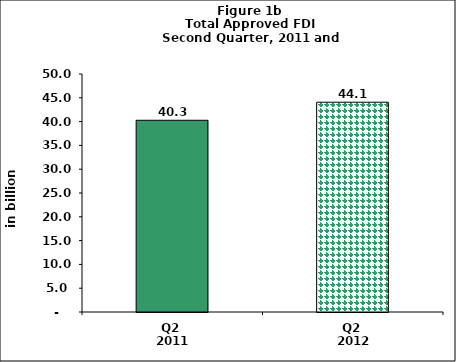
| Category | Series 0 |
|---|---|
| Q2 
2011 | 40.28 |
| Q2 
2012 | 44.068 |